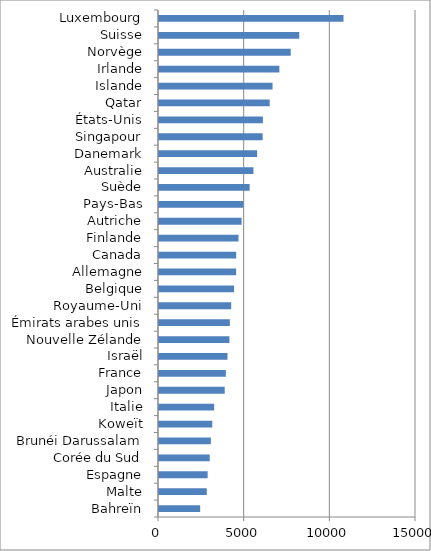
| Category | Series 0 |
|---|---|
| Bahreïn | 2402.967 |
| Malte | 2787.998 |
| Espagne | 2839.119 |
| Corée du Sud | 2962.338 |
| Brunéi Darussalam | 3026.523 |
| Koweït | 3110.297 |
| Italie | 3218.186 |
| Japon | 3834.738 |
| France | 3899.702 |
| Israël | 3996.221 |
| Nouvelle Zélande | 4110.66 |
| Émirats arabes unis | 4133.885 |
| Royaume-Uni | 4212.807 |
| Belgique | 4381.613 |
| Allemagne | 4500.836 |
| Canada | 4504.232 |
| Finlande | 4641.347 |
| Autriche | 4822.094 |
| Pays-Bas | 4927.248 |
| Suède | 5293.253 |
| Australie | 5511.862 |
| Danemark | 5727.974 |
| Singapour | 6049.715 |
| États-Unis | 6064.248 |
| Qatar | 6461.412 |
| Islande | 6626.977 |
| Irlande | 7024.47 |
| Norvège | 7687.955 |
| Suisse | 8185.313 |
| Luxembourg | 10767.599 |